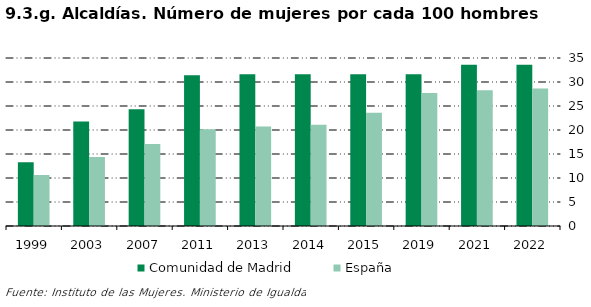
| Category | Comunidad de Madrid | España |
|---|---|---|
| 1999.0 | 13.291 | 10.633 |
| 2003.0 | 21.769 | 14.365 |
| 2007.0 | 24.306 | 17.097 |
| 2011.0 | 31.387 | 20.155 |
| 2013.0 | 31.618 | 20.723 |
| 2014.0 | 31.618 | 21.099 |
| 2015.0 | 31.618 | 23.592 |
| 2019.0 | 31.618 | 27.732 |
| 2021.0 | 33.582 | 28.269 |
| 2022.0 | 33.582 | 28.635 |